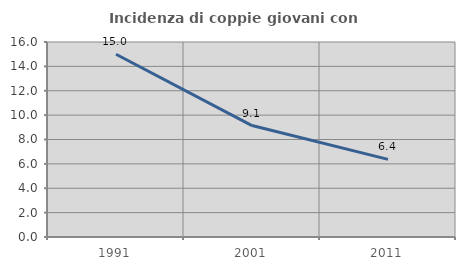
| Category | Incidenza di coppie giovani con figli |
|---|---|
| 1991.0 | 14.992 |
| 2001.0 | 9.143 |
| 2011.0 | 6.368 |